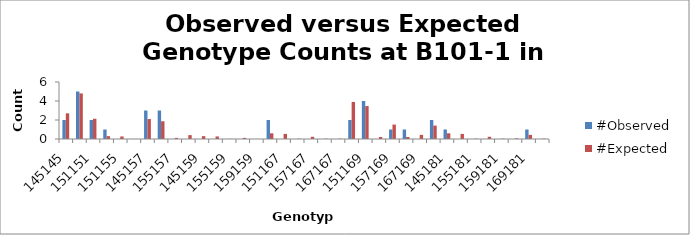
| Category | #Observed | #Expected |
|---|---|---|
| 145145.0 | 2 | 2.7 |
| 145151.0 | 5 | 4.8 |
| 151151.0 | 2 | 2.133 |
| 145155.0 | 1 | 0.3 |
| 151155.0 | 0 | 0.267 |
| 155155.0 | 0 | 0.008 |
| 145157.0 | 3 | 2.1 |
| 151157.0 | 3 | 1.867 |
| 155157.0 | 0 | 0.117 |
| 157157.0 | 0 | 0.408 |
| 145159.0 | 0 | 0.3 |
| 151159.0 | 0 | 0.267 |
| 155159.0 | 0 | 0.017 |
| 157159.0 | 0 | 0.117 |
| 159159.0 | 0 | 0.008 |
| 145167.0 | 2 | 0.6 |
| 151167.0 | 0 | 0.533 |
| 155167.0 | 0 | 0.033 |
| 157167.0 | 0 | 0.233 |
| 159167.0 | 0 | 0.033 |
| 167167.0 | 0 | 0.033 |
| 145169.0 | 2 | 3.9 |
| 151169.0 | 4 | 3.467 |
| 155169.0 | 0 | 0.217 |
| 157169.0 | 1 | 1.517 |
| 159169.0 | 1 | 0.217 |
| 167169.0 | 0 | 0.433 |
| 169169.0 | 2 | 1.408 |
| 145181.0 | 1 | 0.6 |
| 151181.0 | 0 | 0.533 |
| 155181.0 | 0 | 0.033 |
| 157181.0 | 0 | 0.233 |
| 159181.0 | 0 | 0.033 |
| 167181.0 | 0 | 0.067 |
| 169181.0 | 1 | 0.433 |
| 181181.0 | 0 | 0.033 |